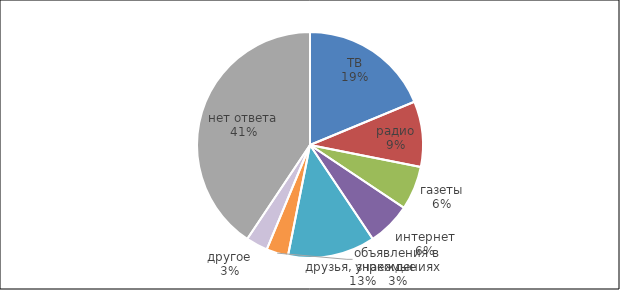
| Category | Series 0 |
|---|---|
| ТВ | 6 |
| радио | 3 |
| газеты | 2 |
| интернет | 2 |
| друзья, знакомые | 4 |
| объявления в учреждениях | 1 |
| другое | 1 |
| нет ответа | 13 |